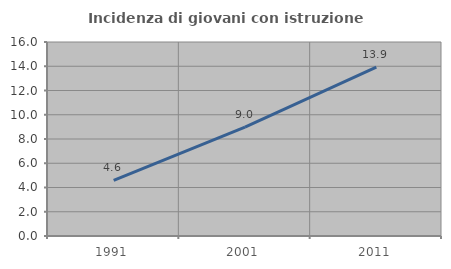
| Category | Incidenza di giovani con istruzione universitaria |
|---|---|
| 1991.0 | 4.585 |
| 2001.0 | 8.974 |
| 2011.0 | 13.929 |